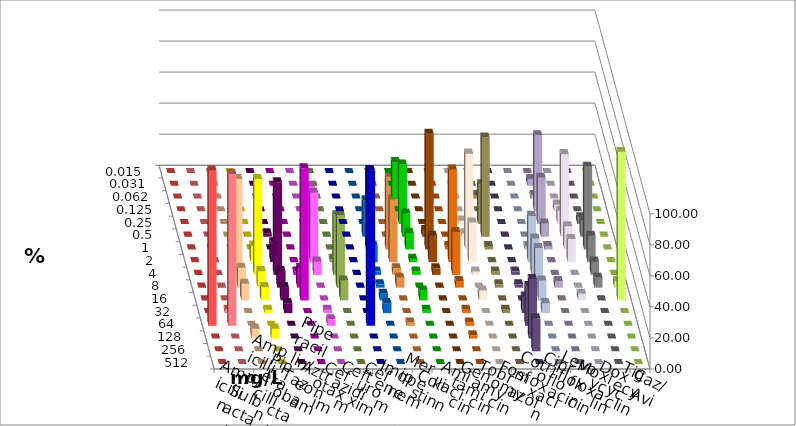
| Category | Ampicillin | Ampicillin/ Sulbactam | Piperacillin | Piperacillin/ Tazobactam | Aztreonam | Cefotaxim | Ceftazidim | Cefuroxim | Imipenem | Meropenem | Colistin | Amikacin | Gentamicin | Tobramycin | Fosfomycin | Cotrimoxazol | Ciprofloxacin | Levofloxacin | Moxifloxacin | Doxycyclin | Tigecyclin | Caz/Avi |
|---|---|---|---|---|---|---|---|---|---|---|---|---|---|---|---|---|---|---|---|---|---|---|
| 0.015 | 0 | 0 | 0 | 0 | 0 | 0 | 0 | 0 | 0 | 0 | 0 | 0 | 0 | 0 | 0 | 0 | 0 | 0 | 0 | 0 | 0 | 0 |
| 0.031 | 0 | 0 | 0 | 0 | 0 | 0 | 0 | 0 | 0 | 0 | 0 | 0 | 0 | 0 | 0 | 0 | 4.255 | 0 | 0 | 0 | 0 | 0 |
| 0.062 | 0 | 0 | 0 | 0 | 0 | 0 | 0 | 0 | 0 | 23.404 | 0 | 0 | 0 | 2.128 | 0 | 0 | 2.128 | 0 | 0 | 0 | 0 | 0 |
| 0.125 | 0 | 0 | 0 | 0 | 0 | 0 | 0 | 0 | 0 | 0 | 0 | 0 | 0 | 0 | 0 | 0 | 48.936 | 4.255 | 0 | 0 | 0 | 0 |
| 0.25 | 0 | 0 | 0 | 0 | 0 | 0 | 0 | 0 | 0 | 38.298 | 0 | 0 | 2.128 | 25.532 | 0 | 0 | 29.787 | 8.511 | 4.255 | 0 | 0 | 0 |
| 0.5 | 0 | 0 | 0 | 0 | 2.128 | 0 | 0 | 0 | 23.404 | 14.894 | 4.255 | 0 | 2.128 | 63.83 | 0 | 0 | 8.511 | 53.191 | 10.638 | 0 | 0 | 0 |
| 1.0 | 0 | 0 | 0 | 0 | 0 | 0 | 40.426 | 0 | 51.064 | 10.638 | 74.468 | 2.128 | 61.702 | 2.128 | 0 | 2.128 | 2.128 | 14.894 | 53.191 | 0 | 0 | 46.809 |
| 2.0 | 0 | 0 | 8.511 | 10.638 | 12.766 | 0 | 44.681 | 0 | 10.638 | 2.128 | 17.021 | 59.574 | 25.532 | 0 | 0 | 29.787 | 0 | 14.894 | 17.021 | 0 | 2.128 | 40.426 |
| 4.0 | 0 | 0 | 61.702 | 61.702 | 59.574 | 2.128 | 8.511 | 0 | 2.128 | 2.128 | 4.255 | 27.66 | 2.128 | 2.128 | 2.128 | 23.404 | 0 | 0 | 8.511 | 0 | 38.298 | 4.255 |
| 8.0 | 0 | 0 | 12.766 | 10.638 | 10.638 | 12.766 | 0 | 0 | 2.128 | 0 | 0 | 4.255 | 0 | 2.128 | 2.128 | 25.532 | 4.255 | 0 | 6.383 | 4.255 | 46.809 | 6.383 |
| 16.0 | 0 | 0 | 10.638 | 8.511 | 8.511 | 85.106 | 0 | 0 | 4.255 | 6.383 | 0 | 0 | 6.383 | 0 | 0 | 12.766 | 0 | 4.255 | 0 | 95.745 | 12.766 | 0 |
| 32.0 | 0 | 2.128 | 0 | 2.128 | 6.383 | 0 | 2.128 | 0 | 6.383 | 2.128 | 0 | 2.128 | 0 | 2.128 | 10.638 | 6.383 | 0 | 0 | 0 | 0 | 0 | 0 |
| 64.0 | 100 | 97.872 | 0 | 0 | 0 | 0 | 4.255 | 100 | 0 | 0 | 0 | 2.128 | 0 | 0 | 25.532 | 0 | 0 | 0 | 0 | 0 | 0 | 2.128 |
| 128.0 | 0 | 0 | 6.383 | 6.383 | 0 | 0 | 0 | 0 | 0 | 0 | 0 | 2.128 | 0 | 0 | 38.298 | 0 | 0 | 0 | 0 | 0 | 0 | 0 |
| 256.0 | 0 | 0 | 0 | 0 | 0 | 0 | 0 | 0 | 0 | 0 | 0 | 0 | 0 | 0 | 21.277 | 0 | 0 | 0 | 0 | 0 | 0 | 0 |
| 512.0 | 0 | 0 | 0 | 0 | 0 | 0 | 0 | 0 | 0 | 0 | 0 | 0 | 0 | 0 | 0 | 0 | 0 | 0 | 0 | 0 | 0 | 0 |